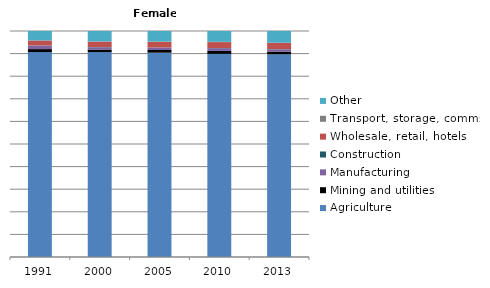
| Category | Agriculture | Mining and utilities | Manufacturing | Construction | Wholesale, retail, hotels | Transport, storage, comms | Other |
|---|---|---|---|---|---|---|---|
| 1991.0 | 90.6 | 1.3 | 1.5 | 0.1 | 2.2 | 0 | 4.2 |
| 2000.0 | 90.6 | 1.1 | 1 | 0.1 | 2.4 | 0.1 | 4.6 |
| 2005.0 | 90.4 | 1.2 | 1 | 0.1 | 2.5 | 0.1 | 4.7 |
| 2010.0 | 89.7 | 1.3 | 1.2 | 0.1 | 2.6 | 0.1 | 4.8 |
| 2013.0 | 89.7 | 1.2 | 1 | 0.1 | 2.7 | 0.1 | 5.2 |